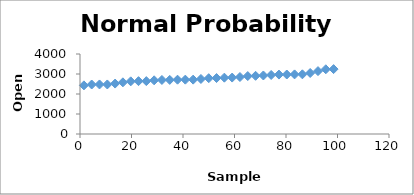
| Category | Series 0 |
|---|---|
| 1.5151515151515151 | 2431.39 |
| 4.545454545454545 | 2474.42 |
| 7.575757575757576 | 2476.96 |
| 10.606060606060606 | 2477.1 |
| 13.636363636363637 | 2521.2 |
| 16.666666666666668 | 2583.21 |
| 19.696969696969695 | 2633.45 |
| 22.727272727272727 | 2642.96 |
| 25.757575757575758 | 2645.1 |
| 28.78787878787879 | 2683.73 |
| 31.81818181818182 | 2702.32 |
| 34.84848484848485 | 2704.95 |
| 37.878787878787875 | 2715.22 |
| 40.90909090909091 | 2717.58 |
| 43.93939393939394 | 2718.7 |
| 46.96969696969697 | 2751.53 |
| 50.0 | 2790.5 |
| 53.03030303030303 | 2798.22 |
| 56.06060606060606 | 2816.45 |
| 59.09090909090909 | 2821.17 |
| 62.121212121212125 | 2848.63 |
| 65.15151515151514 | 2896.96 |
| 68.18181818181819 | 2909.01 |
| 71.21212121212122 | 2926.29 |
| 74.24242424242424 | 2952.33 |
| 77.27272727272727 | 2971.41 |
| 80.3030303030303 | 2974.28 |
| 83.33333333333333 | 2980.32 |
| 86.36363636363636 | 2983.69 |
| 89.39393939393939 | 3050.72 |
| 92.42424242424242 | 3143.85 |
| 95.45454545454545 | 3235.66 |
| 98.48484848484848 | 3244.67 |